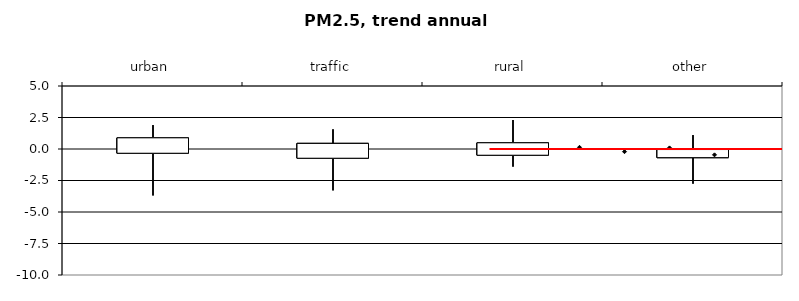
| Category | 25% | min | max | 75% |
|---|---|---|---|---|
| urban | -0.336 | -3.684 | 1.896 | 0.887 |
| traffic | -0.732 | -3.282 | 1.557 | 0.445 |
| rural | -0.494 | -1.397 | 2.298 | 0.492 |
| other | -0.685 | -2.75 | 1.102 | -0.043 |